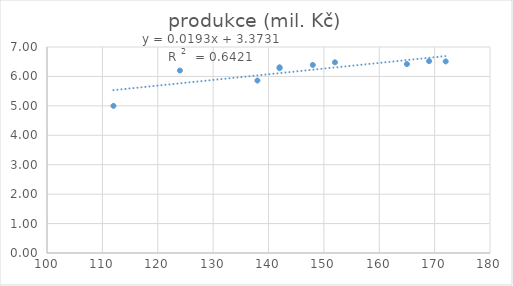
| Category | produkce (mil. Kč) |
|---|---|
| 142.0 | 6.28 |
| 138.0 | 5.86 |
| 165.0 | 6.42 |
| 112.0 | 5 |
| 152.0 | 6.48 |
| 148.0 | 6.39 |
| 142.0 | 6.31 |
| 124.0 | 6.2 |
| 172.0 | 6.51 |
| 169.0 | 6.52 |